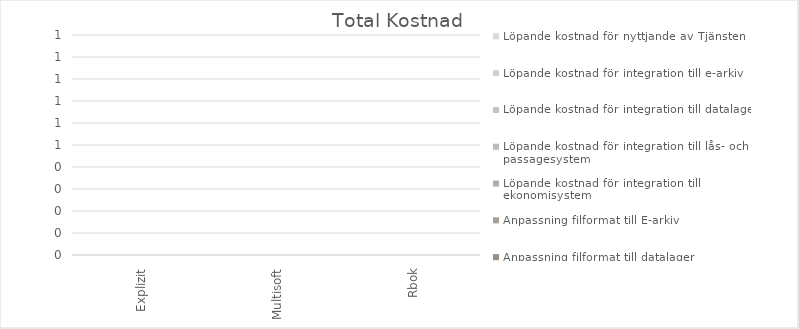
| Category | Etableringskostnad 
I enlighet med Kontraktsvillkoren punkt 5.2.8.1.  | Införandeprojekt inkl. införandeplan
I enlighet med Kontraktsvillkoren punkt 5.2.8.2. | Integration till ekonomisystem | Integration till lås- och passagesystem | Integration till datalager | Integration till e-arkiv | Anpassning filformat till Ekonomi, Utbetalning | Anpassning filformat till passagesystem | Anpassning filformat till datalager | Anpassning filformat till E-arkiv | Löpande kostnad för integration till ekonomisystem | Löpande kostnad för integration till lås- och passagesystem | Löpande kostnad för integration till datalager | Löpande kostnad för integration till e-arkiv | Löpande kostnad för nyttjande av Tjänsten |
|---|---|---|---|---|---|---|---|---|---|---|---|---|---|---|---|
| Explizit | 0 | 0 | 0 | 0 | 0 | 0 | 0 | 0 | 0 | 0 | 0 | 0 | 0 | 0 | 0 |
| Multisoft | 0 | 0 | 0 | 0 | 0 | 0 | 0 | 0 | 0 | 0 | 0 | 0 | 0 | 0 | 0 |
| Rbok | 0 | 0 | 0 | 0 | 0 | 0 | 0 | 0 | 0 | 0 | 0 | 0 | 0 | 0 | 0 |